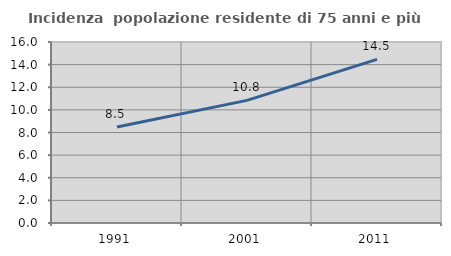
| Category | Incidenza  popolazione residente di 75 anni e più |
|---|---|
| 1991.0 | 8.483 |
| 2001.0 | 10.84 |
| 2011.0 | 14.463 |